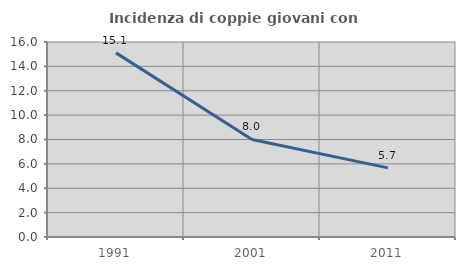
| Category | Incidenza di coppie giovani con figli |
|---|---|
| 1991.0 | 15.107 |
| 2001.0 | 8.001 |
| 2011.0 | 5.67 |